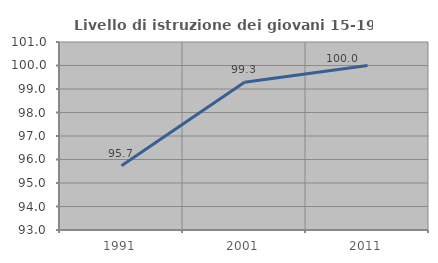
| Category | Livello di istruzione dei giovani 15-19 anni |
|---|---|
| 1991.0 | 95.736 |
| 2001.0 | 99.291 |
| 2011.0 | 100 |